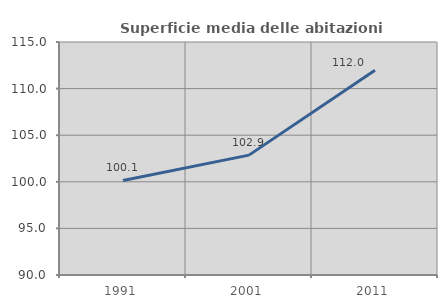
| Category | Superficie media delle abitazioni occupate |
|---|---|
| 1991.0 | 100.148 |
| 2001.0 | 102.863 |
| 2011.0 | 111.963 |